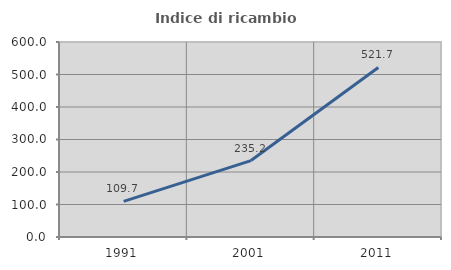
| Category | Indice di ricambio occupazionale  |
|---|---|
| 1991.0 | 109.677 |
| 2001.0 | 235.211 |
| 2011.0 | 521.739 |